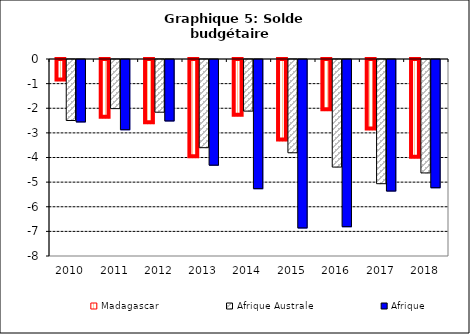
| Category | Madagascar | Afrique Australe | Afrique |
|---|---|---|---|
| 2010.0 | -0.869 | -2.477 | -2.535 |
| 2011.0 | -2.386 | -1.995 | -2.853 |
| 2012.0 | -2.612 | -2.14 | -2.495 |
| 2013.0 | -3.988 | -3.581 | -4.291 |
| 2014.0 | -2.3 | -2.096 | -5.245 |
| 2015.0 | -3.312 | -3.788 | -6.84 |
| 2016.0 | -2.077 | -4.368 | -6.79 |
| 2017.0 | -2.862 | -5.043 | -5.342 |
| 2018.0 | -4.01 | -4.606 | -5.208 |